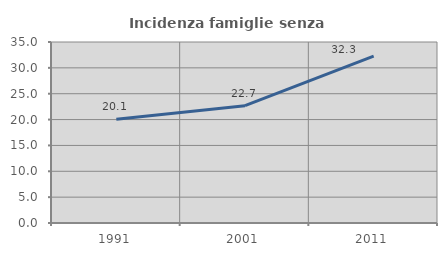
| Category | Incidenza famiglie senza nuclei |
|---|---|
| 1991.0 | 20.057 |
| 2001.0 | 22.686 |
| 2011.0 | 32.287 |